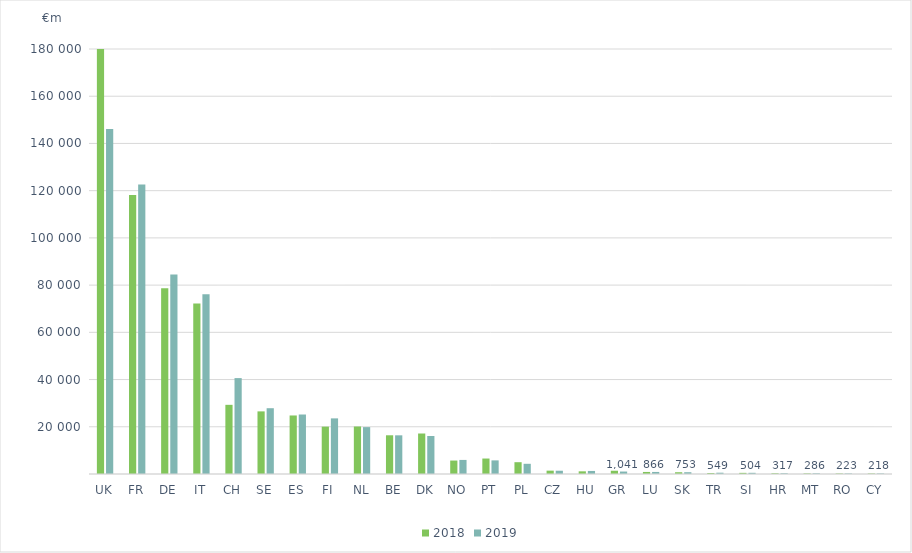
| Category | 2018 | 2019 |
|---|---|---|
| UK | 250918.806 | 146121.487 |
| FR | 118214 | 122662 |
| DE | 78683 | 84484 |
| IT | 72207 | 76161 |
| CH | 29293.006 | 40616.354 |
| SE | 26522.273 | 27862.802 |
| ES | 24788 | 25197 |
| FI | 20062 | 23559 |
| NL | 20121 | 19856 |
| BE | 16401.278 | 16380.434 |
| DK | 17151.123 | 16092.605 |
| NO | 5697.739 | 5959.842 |
| PT | 6551.225 | 5768.425 |
| PL | 4999.302 | 4320.086 |
| CZ | 1419.673 | 1385.937 |
| HU | 1133.309 | 1292.538 |
| GR | 1382 | 1041 |
| LU | 866 | 866 |
| SK | 747 | 753 |
| TR | 415.553 | 549.404 |
| SI | 484.27 | 503.64 |
| HR | 311.809 | 317.201 |
| MT | 246.62 | 286.44 |
| RO | 216.214 | 222.957 |
| CY | 213 | 218 |